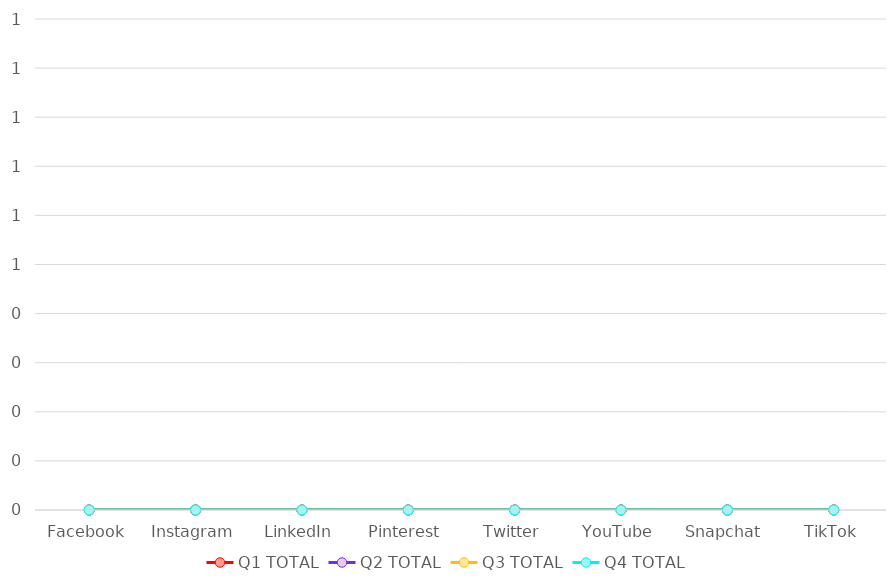
| Category | Q1 TOTAL | Q2 TOTAL | Q3 TOTAL | Q4 TOTAL |
|---|---|---|---|---|
| Facebook | 0 | 0 | 0 | 0 |
| Instagram | 0 | 0 | 0 | 0 |
| LinkedIn | 0 | 0 | 0 | 0 |
| Pinterest | 0 | 0 | 0 | 0 |
| Twitter | 0 | 0 | 0 | 0 |
| YouTube | 0 | 0 | 0 | 0 |
| Snapchat | 0 | 0 | 0 | 0 |
| TikTok | 0 | 0 | 0 | 0 |